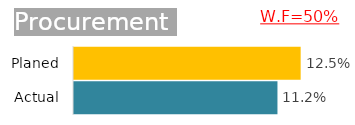
| Category | Procurement |
|---|---|
| Actual | 0.112 |
| Planed | 0.125 |